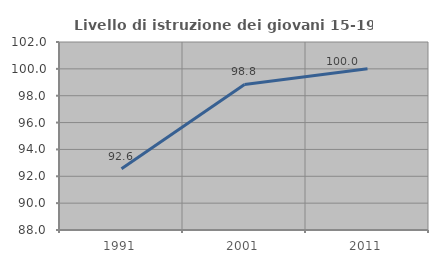
| Category | Livello di istruzione dei giovani 15-19 anni |
|---|---|
| 1991.0 | 92.553 |
| 2001.0 | 98.837 |
| 2011.0 | 100 |